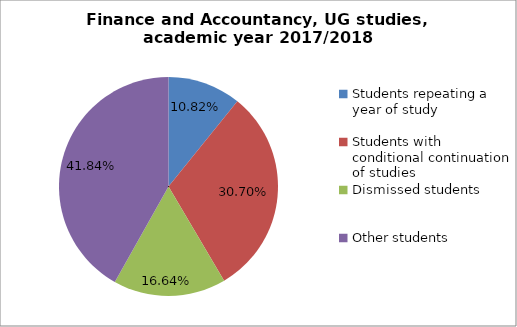
| Category | Series 0 |
|---|---|
| Students repeating a year of study | 67 |
| Students with conditional continuation of studies | 190 |
| Dismissed students | 103 |
| Other students | 259 |